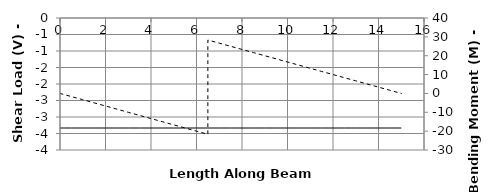
| Category | V |
|---|---|
| 0.0 | -3.333 |
| 0.0 | -3.333 |
| 0.5 | -3.333 |
| 1.0 | -3.333 |
| 1.5 | -3.333 |
| 2.0 | -3.333 |
| 2.5 | -3.333 |
| 3.0 | -3.333 |
| 3.5 | -3.333 |
| 4.0 | -3.333 |
| 4.5 | -3.333 |
| 5.0 | -3.333 |
| 5.5 | -3.333 |
| 6.0 | -3.333 |
| 6.49999 | -3.333 |
| 6.5 | -3.333 |
| 7.0 | -3.333 |
| 7.5 | -3.333 |
| 8.0 | -3.333 |
| 8.5 | -3.333 |
| 9.0 | -3.333 |
| 9.5 | -3.333 |
| 10.0 | -3.333 |
| 10.5 | -3.333 |
| 11.0 | -3.333 |
| 11.5 | -3.333 |
| 12.0 | -3.333 |
| 12.5 | -3.333 |
| 13.0 | -3.333 |
| 13.5 | -3.333 |
| 14.0 | -3.333 |
| 14.5 | -3.333 |
| 15.0 | -3.333 |
| 15.0 | -3.333 |